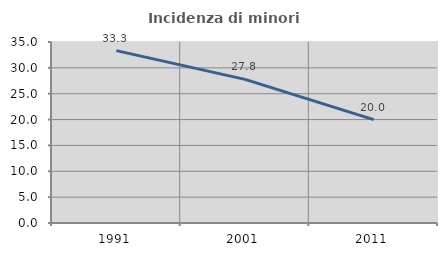
| Category | Incidenza di minori stranieri |
|---|---|
| 1991.0 | 33.333 |
| 2001.0 | 27.778 |
| 2011.0 | 20 |